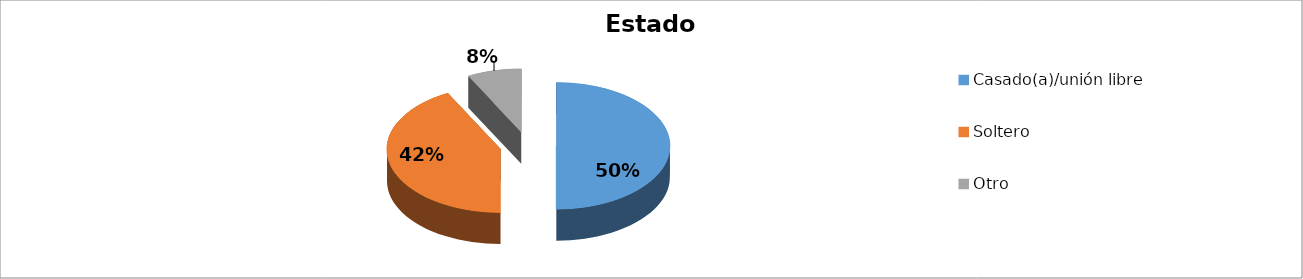
| Category | Series 0 |
|---|---|
| Casado(a)/unión libre | 0.5 |
| Soltero | 0.423 |
| Otro | 0.077 |